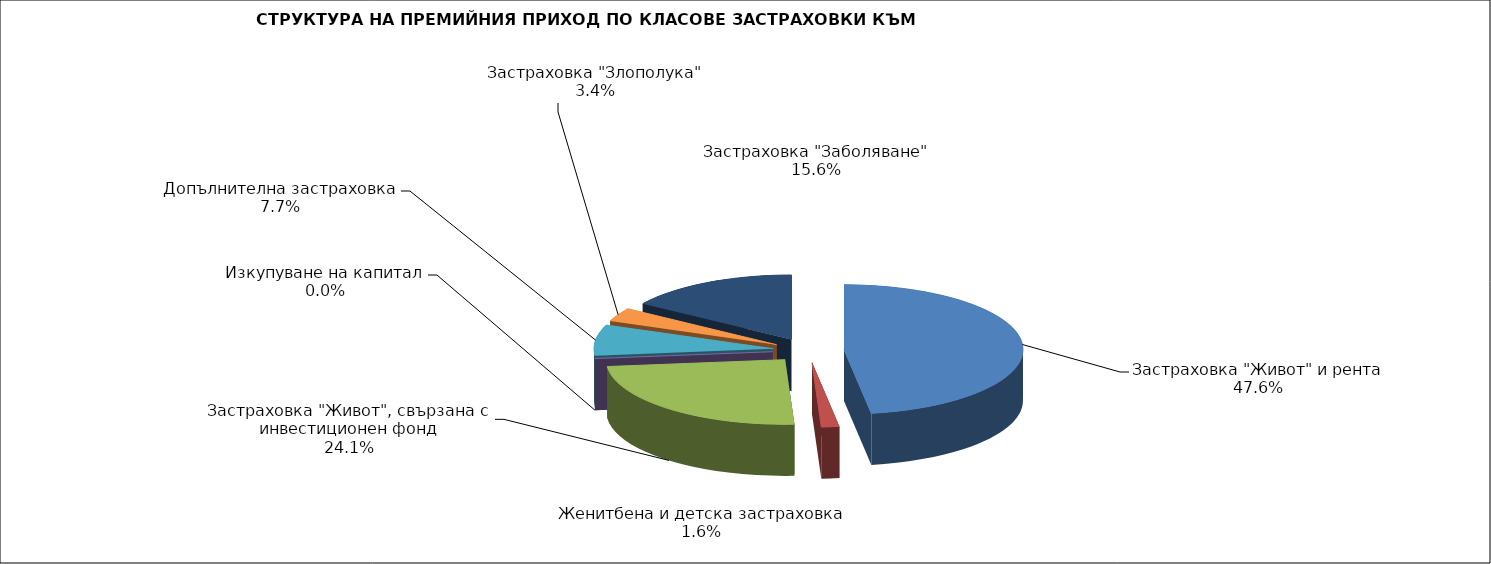
| Category | Series 0 |
|---|---|
| Застраховка "Живот" и рента | 190512257.453 |
| Женитбена и детска застраховка | 6468944.563 |
| Застраховка "Живот", свързана с инвестиционен фонд | 96656551.966 |
| Изкупуване на капитал | 0 |
| Допълнителна застраховка | 30690080.109 |
| Застраховка "Злополука" | 13686353.89 |
| Застраховка "Заболяване" | 62565325.18 |